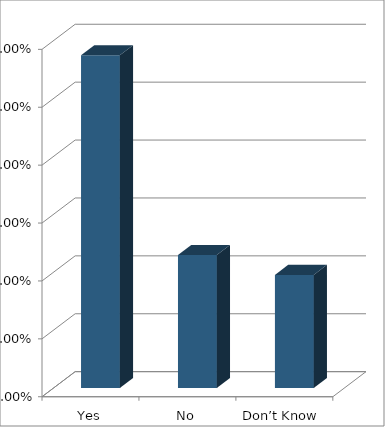
| Category | Series 0 |
|---|---|
| Yes | 0.575 |
| No | 0.23 |
| Don’t Know  | 0.195 |